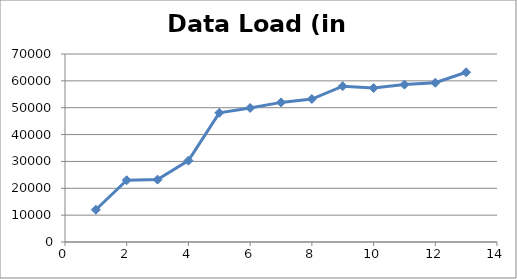
| Category | Data Load (in MB) |
|---|---|
| 1.0 | 12000 |
| 2.0 | 23000 |
| 3.0 | 23230 |
| 4.0 | 30300 |
| 5.0 | 48100 |
| 6.0 | 49920 |
| 7.0 | 51980 |
| 8.0 | 53240 |
| 9.0 | 58010 |
| 10.0 | 57310 |
| 11.0 | 58600 |
| 12.0 | 59300 |
| 13.0 | 63200 |